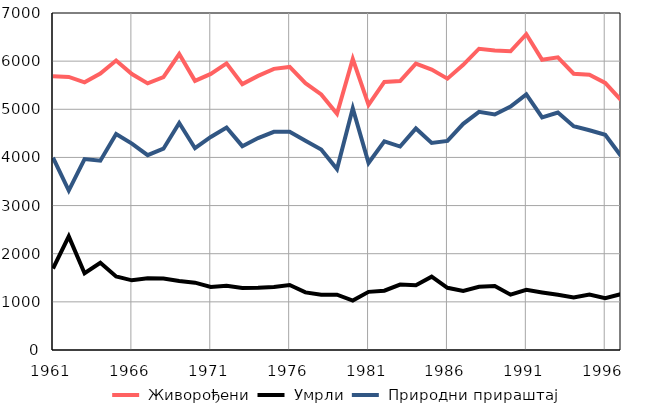
| Category |  Живорођени |  Умрли |  Природни прираштај |
|---|---|---|---|
| 1961.0 | 5687 | 1692 | 3995 |
| 1962.0 | 5672 | 2360 | 3312 |
| 1963.0 | 5560 | 1595 | 3965 |
| 1964.0 | 5743 | 1811 | 3932 |
| 1965.0 | 6013 | 1527 | 4486 |
| 1966.0 | 5733 | 1447 | 4286 |
| 1967.0 | 5538 | 1492 | 4046 |
| 1968.0 | 5666 | 1485 | 4181 |
| 1969.0 | 6147 | 1432 | 4715 |
| 1970.0 | 5590 | 1399 | 4191 |
| 1971.0 | 5734 | 1309 | 4425 |
| 1972.0 | 5954 | 1333 | 4621 |
| 1973.0 | 5523 | 1289 | 4234 |
| 1974.0 | 5694 | 1291 | 4403 |
| 1975.0 | 5840 | 1309 | 4531 |
| 1976.0 | 5880 | 1349 | 4531 |
| 1977.0 | 5542 | 1196 | 4346 |
| 1978.0 | 5310 | 1146 | 4164 |
| 1979.0 | 4908 | 1150 | 3758 |
| 1980.0 | 6045 | 1026 | 5019 |
| 1981.0 | 5092 | 1208 | 3884 |
| 1982.0 | 5568 | 1232 | 4336 |
| 1983.0 | 5586 | 1360 | 4226 |
| 1984.0 | 5947 | 1345 | 4602 |
| 1985.0 | 5824 | 1523 | 4301 |
| 1986.0 | 5636 | 1292 | 4344 |
| 1987.0 | 5924 | 1226 | 4698 |
| 1988.0 | 6258 | 1312 | 4946 |
| 1989.0 | 6221 | 1329 | 4892 |
| 1990.0 | 6205 | 1150 | 5055 |
| 1991.0 | 6560 | 1250 | 5310 |
| 1992.0 | 6027 | 1196 | 4831 |
| 1993.0 | 6080 | 1148 | 4932 |
| 1994.0 | 5739 | 1090 | 4649 |
| 1995.0 | 5719 | 1154 | 4565 |
| 1996.0 | 5547 | 1075 | 4472 |
| 1997.0 | 5192 | 1162 | 4030 |